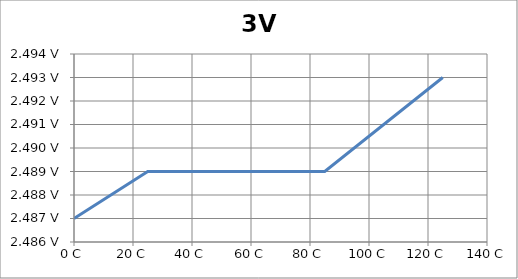
| Category | 3V 20mA |
|---|---|
| 0.0 | 2.487 |
| 25.0 | 2.489 |
| 70.0 | 2.489 |
| 85.0 | 2.489 |
| 125.0 | 2.493 |